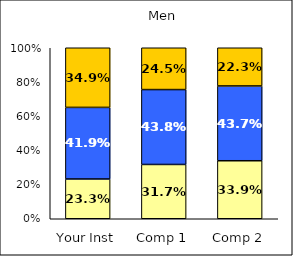
| Category | Low Academic Adjustment | Average Academic Adjustment | High Academic Adjustment |
|---|---|---|---|
| Your Inst | 0.233 | 0.419 | 0.349 |
| Comp 1 | 0.317 | 0.438 | 0.245 |
| Comp 2 | 0.339 | 0.437 | 0.223 |